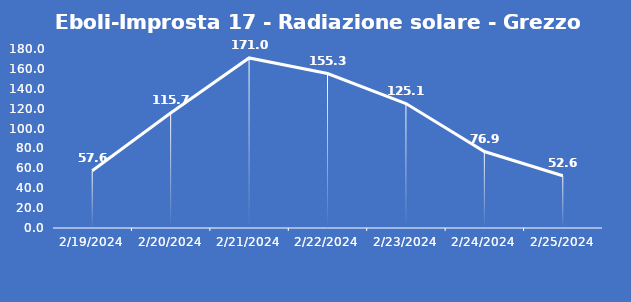
| Category | Eboli-Improsta 17 - Radiazione solare - Grezzo (W/m2) |
|---|---|
| 2/19/24 | 57.6 |
| 2/20/24 | 115.7 |
| 2/21/24 | 171 |
| 2/22/24 | 155.3 |
| 2/23/24 | 125.1 |
| 2/24/24 | 76.9 |
| 2/25/24 | 52.6 |